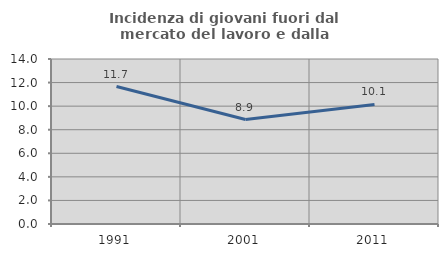
| Category | Incidenza di giovani fuori dal mercato del lavoro e dalla formazione  |
|---|---|
| 1991.0 | 11.661 |
| 2001.0 | 8.865 |
| 2011.0 | 10.149 |